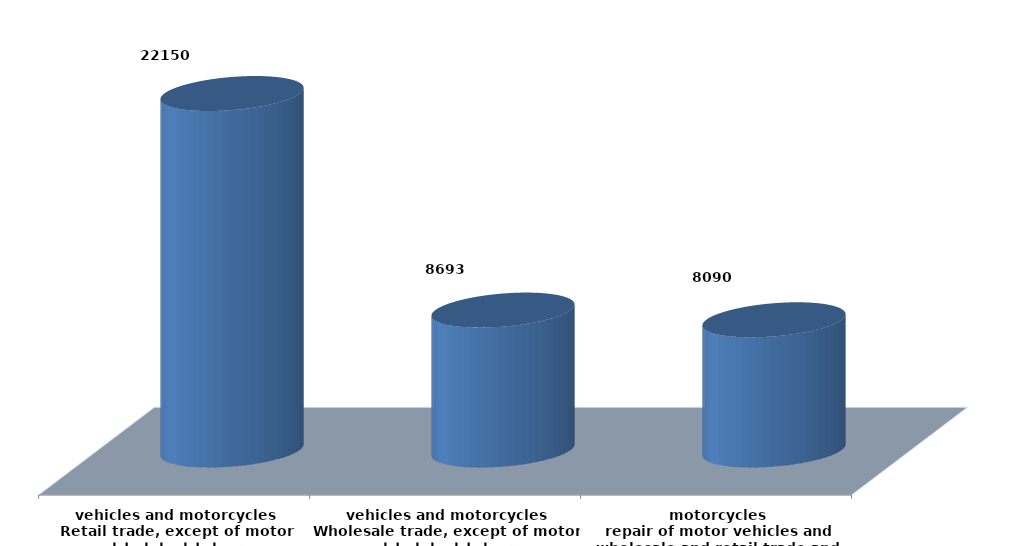
| Category | Series 0 |
|---|---|
| تجارة الجملة والتجزئة ،واصلاح المركبات ذات المحركات والدراجات النارية
wholesale and retail trade and repair of motor vehicles and motorcycles | 8090469 |
| تجارة الجملة ، باستثناء المركبات ذات المحركات والدراجات النارية
Wholesale trade, except of motor vehicles and motorcycles | 8692744 |
| تجارة التجزئة،باستثناء المركبات ذات المحركات والدراجات النارية
Retail trade, except of motor vehicles and motorcycles | 22149662 |